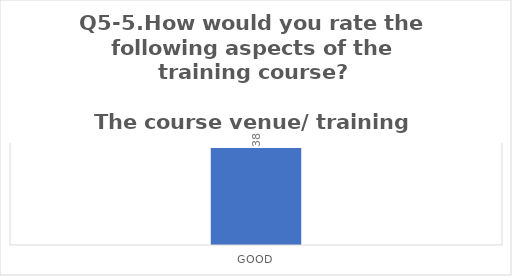
| Category | Q5-5.How would you rate the following aspects of the training course?

The course venue/ training centre |
|---|---|
| Good | 38 |